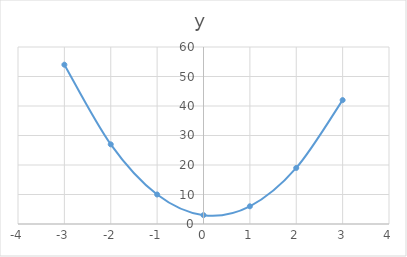
| Category | y |
|---|---|
| -3.0 | 54 |
| -2.0 | 27 |
| -1.0 | 10 |
| 0.0 | 3 |
| 1.0 | 6 |
| 2.0 | 19 |
| 3.0 | 42 |